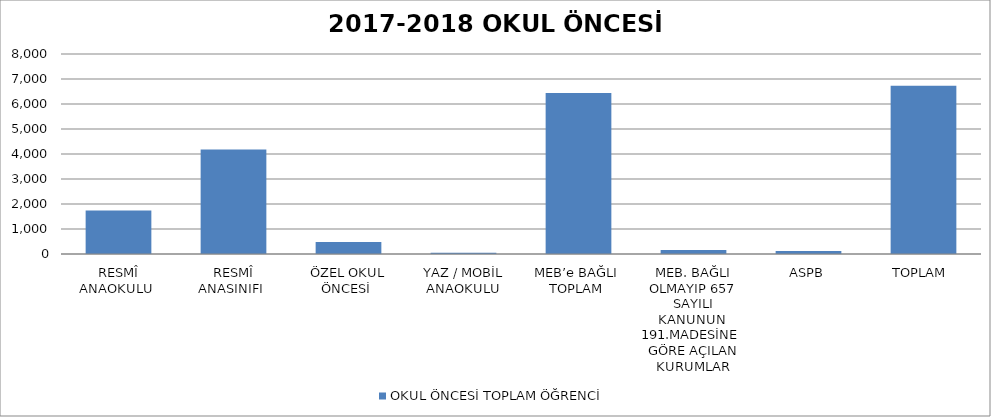
| Category | OKUL ÖNCESİ TOPLAM ÖĞRENCİ |
|---|---|
| RESMÎ ANAOKULU  | 1737 |
| RESMÎ ANASINIFI  | 4177 |
| ÖZEL OKUL ÖNCESİ  | 484 |
| YAZ / MOBİL ANAOKULU | 47 |
| MEB’e BAĞLI  TOPLAM  | 6445 |
| MEB. BAĞLI OLMAYIP 657 SAYILI KANUNUN  191.MADESİNE  GÖRE AÇILAN KURUMLAR | 163 |
| ASPB | 121 |
| TOPLAM  | 6729 |